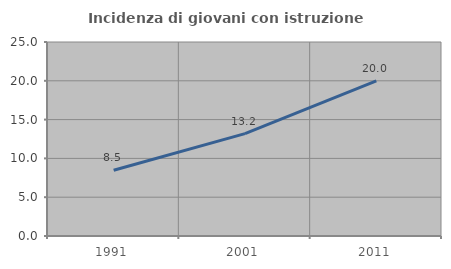
| Category | Incidenza di giovani con istruzione universitaria |
|---|---|
| 1991.0 | 8.475 |
| 2001.0 | 13.19 |
| 2011.0 | 20 |